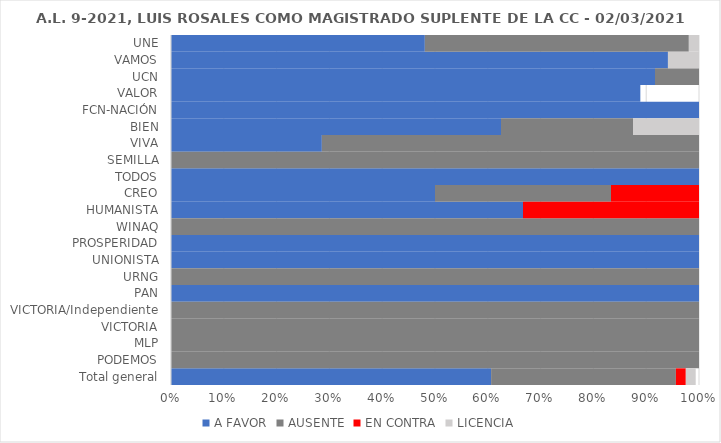
| Category | A FAVOR | AUSENTE | EN CONTRA | LICENCIA |
|---|---|---|---|---|
| UNE | 0.481 | 0.5 | 0 | 0.019 |
| VAMOS | 0.941 | 0 | 0 | 0.059 |
| UCN | 0.917 | 0.083 | 0 | 0 |
| VALOR | 0.889 | 0 | 0 | 0 |
| FCN-NACIÓN | 1 | 0 | 0 | 0 |
| BIEN | 0.625 | 0.25 | 0 | 0.125 |
| VIVA | 0.286 | 0.714 | 0 | 0 |
| SEMILLA | 0 | 1 | 0 | 0 |
| TODOS | 1 | 0 | 0 | 0 |
| CREO | 0.5 | 0.333 | 0.167 | 0 |
| HUMANISTA | 0.667 | 0 | 0.333 | 0 |
| WINAQ | 0 | 1 | 0 | 0 |
| PROSPERIDAD | 1 | 0 | 0 | 0 |
| UNIONISTA | 1 | 0 | 0 | 0 |
| URNG | 0 | 1 | 0 | 0 |
| PAN | 1 | 0 | 0 | 0 |
| VICTORIA/Independiente | 0 | 1 | 0 | 0 |
| VICTORIA | 0 | 1 | 0 | 0 |
| MLP | 0 | 1 | 0 | 0 |
| PODEMOS | 0 | 1 | 0 | 0 |
| Total general | 0.606 | 0.35 | 0.019 | 0.019 |